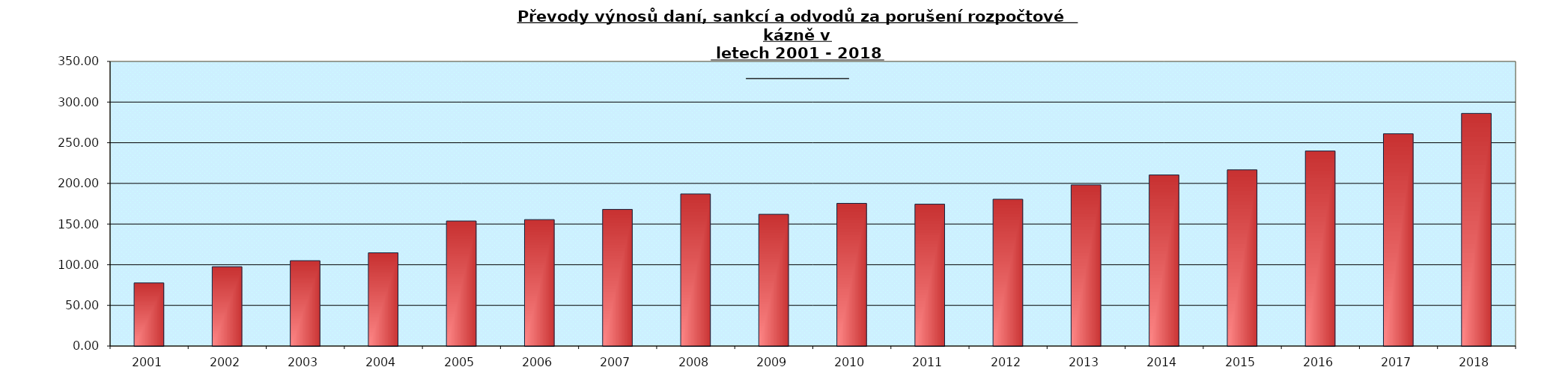
| Category | Series 1 |
|---|---|
| 2001.0 | 77.62 |
| 2002.0 | 97.559 |
| 2003.0 | 104.974 |
| 2004.0 | 114.659 |
| 2005.0 | 153.772 |
| 2006.0 | 155.476 |
| 2007.0 | 167.992 |
| 2008.0 | 187.032 |
| 2009.0 | 162.022 |
| 2010.0 | 175.47 |
| 2011.0 | 174.461 |
| 2012.0 | 180.539 |
| 2013.0 | 198.134 |
| 2014.0 | 210.384 |
| 2015.0 | 216.671 |
| 2016.0 | 239.846 |
| 2017.0 | 261.032 |
| 2018.0 | 286.1 |